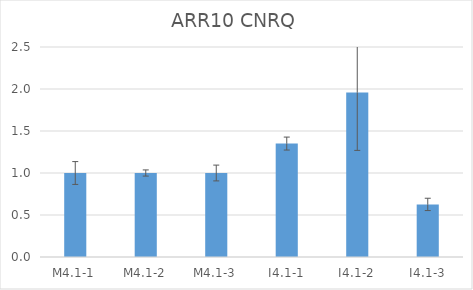
| Category | ARR10 CNRQ |
|---|---|
| M4.1-1 | 1 |
| M4.1-2 | 1 |
| M4.1-3 | 1 |
| I4.1-1 | 1.35 |
| I4.1-2 | 1.959 |
| I4.1-3 | 0.626 |